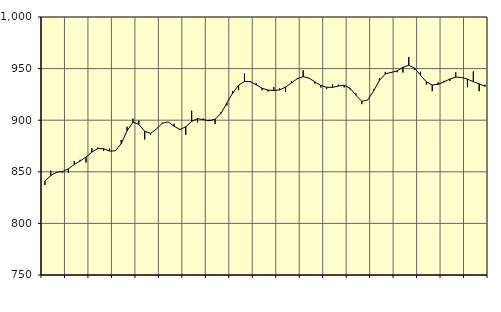
| Category | Piggar | Series 1 |
|---|---|---|
| nan | 837.2 | 841.06 |
| 1.0 | 851.1 | 846.41 |
| 1.0 | 849.7 | 849.55 |
| 1.0 | 849.1 | 850.34 |
| nan | 848.9 | 852.86 |
| 2.0 | 860.4 | 857.1 |
| 2.0 | 861.6 | 860.46 |
| 2.0 | 858.9 | 864.3 |
| nan | 872.9 | 869.09 |
| 3.0 | 873.5 | 872.45 |
| 3.0 | 870.3 | 872.39 |
| 3.0 | 872.5 | 870.13 |
| nan | 870.6 | 870.34 |
| 4.0 | 880.8 | 877.29 |
| 4.0 | 893.7 | 889.75 |
| 4.0 | 901.5 | 898.12 |
| nan | 899.5 | 896 |
| 5.0 | 881.3 | 889.21 |
| 5.0 | 885.6 | 887.3 |
| 5.0 | 891.4 | 891.49 |
| nan | 897.8 | 897 |
| 6.0 | 898.4 | 898.31 |
| 6.0 | 896.6 | 894.19 |
| 6.0 | 890.5 | 890.98 |
| nan | 885.8 | 893.61 |
| 7.0 | 909.2 | 898.78 |
| 7.0 | 897.8 | 901.5 |
| 7.0 | 901.5 | 900.51 |
| nan | 900.5 | 899.45 |
| 8.0 | 896.4 | 900.97 |
| 8.0 | 907.9 | 906.56 |
| 8.0 | 914.2 | 916.73 |
| nan | 928.3 | 926.4 |
| 9.0 | 929.1 | 933.8 |
| 9.0 | 945.2 | 937.59 |
| 9.0 | 938 | 937.34 |
| nan | 935.8 | 934.34 |
| 10.0 | 929 | 930.95 |
| 10.0 | 927.8 | 929.19 |
| 10.0 | 932 | 928.72 |
| nan | 930.8 | 929.37 |
| 11.0 | 927.5 | 932.01 |
| 11.0 | 937.9 | 936.18 |
| 11.0 | 939.8 | 940.27 |
| nan | 948.4 | 942.21 |
| 12.0 | 940.9 | 940.8 |
| 12.0 | 935.6 | 937.13 |
| 12.0 | 931.7 | 933.6 |
| nan | 930.2 | 931.9 |
| 13.0 | 934.7 | 931.82 |
| 13.0 | 934.5 | 933.06 |
| 13.0 | 931.8 | 933.83 |
| nan | 929.9 | 930.96 |
| 14.0 | 926.1 | 924.11 |
| 14.0 | 915.6 | 918.3 |
| 14.0 | 919.5 | 919.57 |
| nan | 930 | 928.27 |
| 15.0 | 940.6 | 938.55 |
| 15.0 | 946.8 | 944.88 |
| 15.0 | 946 | 946.29 |
| nan | 946.5 | 947.71 |
| 16.0 | 946.2 | 951.29 |
| 16.0 | 961.3 | 953.2 |
| 16.0 | 948.8 | 950.51 |
| nan | 946.9 | 943.73 |
| 17.0 | 934.6 | 937.09 |
| 17.0 | 928.1 | 934.13 |
| 17.0 | 936.7 | 934.74 |
| nan | 938.2 | 937.06 |
| 18.0 | 938 | 939.94 |
| 18.0 | 946.3 | 941.72 |
| 18.0 | 941.3 | 941.48 |
| nan | 931.9 | 939.78 |
| 19.0 | 947.2 | 937.29 |
| 19.0 | 928.1 | 935.28 |
| 19.0 | 934.3 | 932.81 |